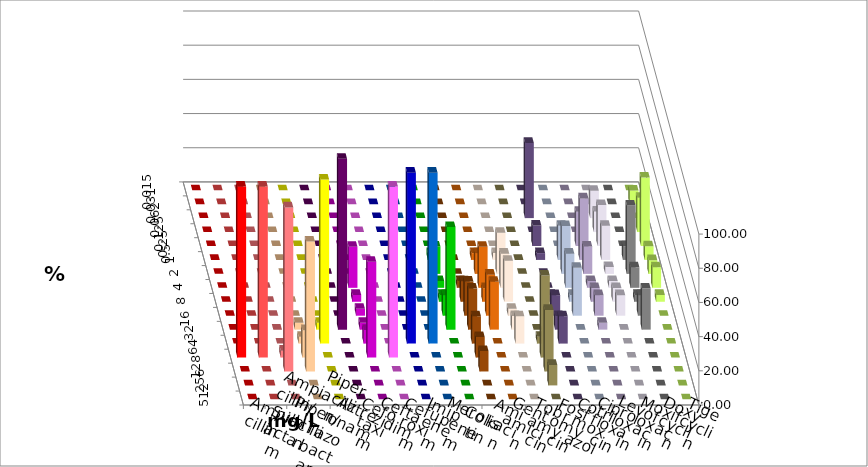
| Category | Ampicillin | Ampicillin/ Sulbactam | Piperacillin | Piperacillin/ Tazobactam | Aztreonam | Cefotaxim | Ceftazidim | Cefuroxim | Imipenem | Meropenem | Colistin | Amikacin | Gentamicin | Tobramycin | Fosfomycin | Cotrimoxazol | Ciprofloxacin | Levofloxacin | Moxifloxacin | Doxycyclin | Tigecyclin |
|---|---|---|---|---|---|---|---|---|---|---|---|---|---|---|---|---|---|---|---|---|---|
| 0.015 | 0 | 0 | 0 | 0 | 0 | 0 | 0 | 0 | 0 | 0 | 0 | 0 | 0 | 0 | 0 | 0 | 0 | 0 | 0 | 0 | 0 |
| 0.031 | 0 | 0 | 0 | 0 | 0 | 0 | 0 | 0 | 0 | 0 | 0 | 0 | 0 | 0 | 0 | 0 | 0 | 0 | 0 | 0 | 8 |
| 0.062 | 0 | 0 | 0 | 0 | 0 | 0 | 0 | 0 | 0 | 0 | 0 | 0 | 0 | 0 | 0 | 44 | 0 | 0 | 16 | 0 | 0 |
| 0.125 | 0 | 0 | 0 | 0 | 0 | 0 | 0 | 0 | 0 | 0 | 0 | 0 | 0 | 0 | 0 | 0 | 0 | 0 | 12 | 0 | 20 |
| 0.25 | 0 | 0 | 0 | 0 | 0 | 0 | 0 | 0 | 0 | 0 | 0 | 0 | 0 | 0 | 0 | 12 | 0 | 20 | 24 | 0 | 40 |
| 0.5 | 0 | 0 | 0 | 0 | 0 | 0 | 0 | 0 | 0 | 0 | 4 | 0 | 4 | 4 | 0 | 4 | 20 | 36 | 20 | 8 | 8 |
| 1.0 | 0 | 0 | 0 | 0 | 0 | 0 | 0 | 0 | 0 | 0 | 16 | 0 | 12 | 24 | 0 | 0 | 28 | 16 | 4 | 40 | 8 |
| 2.0 | 0 | 0 | 0 | 0 | 0 | 0 | 24 | 0 | 0 | 0 | 4 | 4 | 24 | 20 | 0 | 0 | 20 | 4 | 4 | 12 | 12 |
| 4.0 | 0 | 0 | 0 | 0 | 0 | 0 | 4 | 0 | 0 | 0 | 4 | 12 | 8 | 24 | 0 | 4 | 4 | 8 | 8 | 4 | 4 |
| 8.0 | 0 | 0 | 0 | 0 | 0 | 0 | 4 | 0 | 0 | 0 | 12 | 20 | 24 | 4 | 0 | 12 | 28 | 12 | 12 | 12 | 0 |
| 16.0 | 0 | 0 | 0 | 4 | 4 | 100 | 4 | 0 | 0 | 0 | 60 | 24 | 28 | 8 | 0 | 8 | 0 | 4 | 0 | 24 | 0 |
| 32.0 | 0 | 0 | 0 | 4 | 96 | 0 | 8 | 0 | 100 | 100 | 0 | 16 | 0 | 16 | 4 | 16 | 0 | 0 | 0 | 0 | 0 |
| 64.0 | 100 | 100 | 4 | 16 | 0 | 0 | 56 | 100 | 0 | 0 | 0 | 12 | 0 | 0 | 48 | 0 | 0 | 0 | 0 | 0 | 0 |
| 128.0 | 0 | 0 | 96 | 76 | 0 | 0 | 0 | 0 | 0 | 0 | 0 | 12 | 0 | 0 | 36 | 0 | 0 | 0 | 0 | 0 | 0 |
| 256.0 | 0 | 0 | 0 | 0 | 0 | 0 | 0 | 0 | 0 | 0 | 0 | 0 | 0 | 0 | 12 | 0 | 0 | 0 | 0 | 0 | 0 |
| 512.0 | 0 | 0 | 0 | 0 | 0 | 0 | 0 | 0 | 0 | 0 | 0 | 0 | 0 | 0 | 0 | 0 | 0 | 0 | 0 | 0 | 0 |